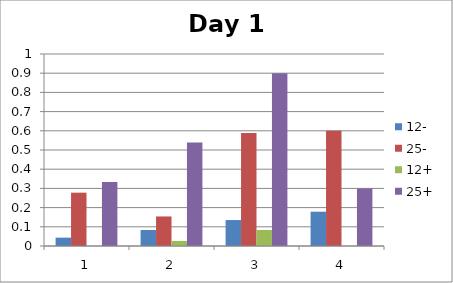
| Category | 12- | 25- | 12+ | 25+ |
|---|---|---|---|---|
| 0 | 0.043 | 0.278 | 0 | 0.333 |
| 1 | 0.083 | 0.154 | 0.026 | 0.538 |
| 2 | 0.135 | 0.588 | 0.083 | 0.9 |
| 3 | 0.179 | 0.6 | 0 | 0.3 |